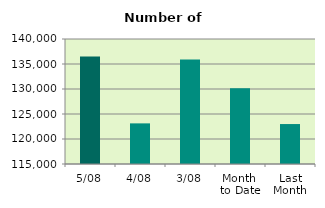
| Category | Series 0 |
|---|---|
| 5/08 | 136486 |
| 4/08 | 123126 |
| 3/08 | 135904 |
| Month 
to Date | 130134.5 |
| Last
Month | 122991 |